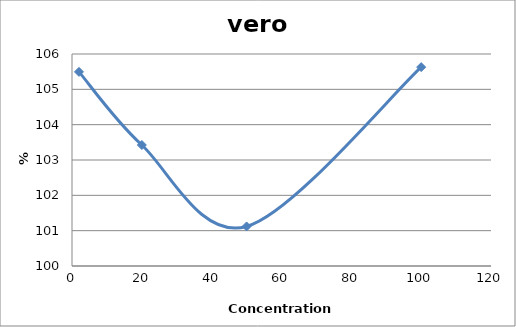
| Category | vero chu2 |
|---|---|
| 100.0 | 105.629 |
| 50.0 | 101.119 |
| 20.0 | 103.424 |
| 2.0 | 105.495 |
| nan | 0 |
| nan | 0 |
| nan | 0 |
| nan | 0 |
| nan | 0 |